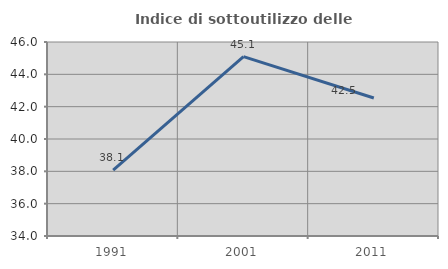
| Category | Indice di sottoutilizzo delle abitazioni  |
|---|---|
| 1991.0 | 38.069 |
| 2001.0 | 45.095 |
| 2011.0 | 42.539 |